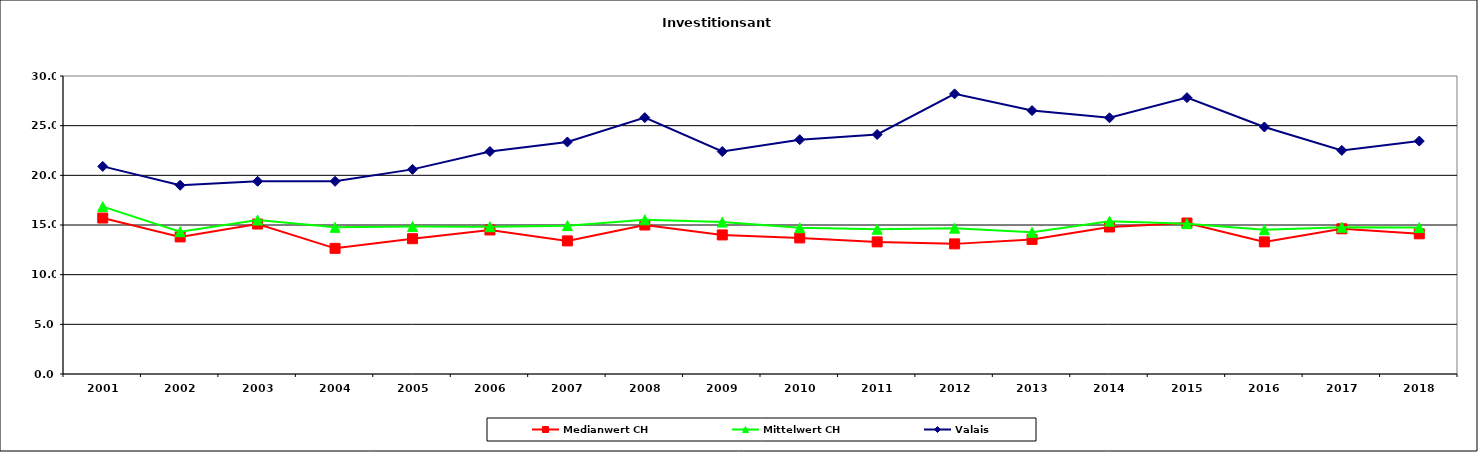
| Category | Medianwert CH | Mittelwert CH | Valais |
|---|---|---|---|
| 2001.0 | 15.7 | 16.85 | 20.9 |
| 2002.0 | 13.8 | 14.325 | 19 |
| 2003.0 | 15.1 | 15.5 | 19.4 |
| 2004.0 | 12.65 | 14.763 | 19.4 |
| 2005.0 | 13.62 | 14.838 | 20.6 |
| 2006.0 | 14.5 | 14.827 | 22.4 |
| 2007.0 | 13.4 | 14.936 | 23.36 |
| 2008.0 | 15 | 15.524 | 25.81 |
| 2009.0 | 14 | 15.293 | 22.4 |
| 2010.0 | 13.7 | 14.722 | 23.59 |
| 2011.0 | 13.3 | 14.574 | 24.11 |
| 2012.0 | 13.1 | 14.682 | 28.2 |
| 2013.0 | 13.55 | 14.269 | 26.52 |
| 2014.0 | 14.8 | 15.38 | 25.795 |
| 2015.0 | 15.2 | 15.136 | 27.82 |
| 2016.0 | 13.3 | 14.519 | 24.87 |
| 2017.0 | 14.617 | 14.771 | 22.51 |
| 2018.0 | 14.111 | 14.743 | 23.45 |